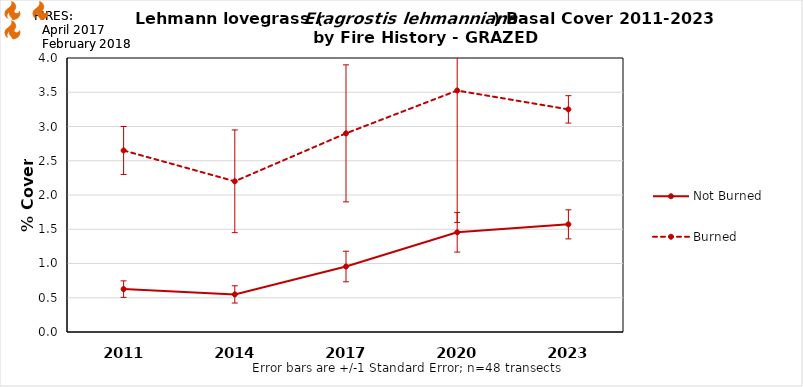
| Category | Not Burned | Burned |
|---|---|---|
| 2011.0 | 0.626 | 2.65 |
| 2014.0 | 0.549 | 2.2 |
| 2017.0 | 0.956 | 2.9 |
| 2020.0 | 1.456 | 3.525 |
| 2023.0 | 1.571 | 3.25 |